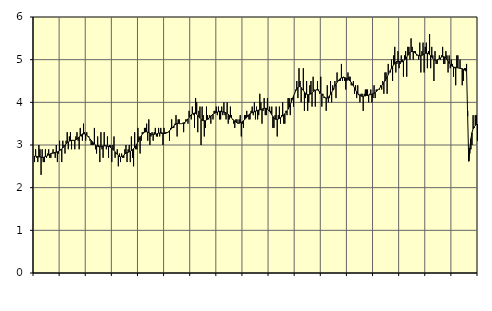
| Category | Hotell och restaurang, SNI 55-56 | Series 1 |
|---|---|---|
| nan | 2.6 | 2.74 |
| 87.0 | 2.9 | 2.74 |
| 87.0 | 2.7 | 2.73 |
| 87.0 | 2.6 | 2.73 |
| 87.0 | 3 | 2.72 |
| 87.0 | 2.9 | 2.72 |
| 87.0 | 2.3 | 2.72 |
| 87.0 | 2.9 | 2.71 |
| 87.0 | 2.6 | 2.71 |
| 87.0 | 2.6 | 2.72 |
| 87.0 | 2.9 | 2.73 |
| 87.0 | 2.7 | 2.74 |
| nan | 2.8 | 2.75 |
| 88.0 | 2.9 | 2.77 |
| 88.0 | 2.7 | 2.78 |
| 88.0 | 2.7 | 2.8 |
| 88.0 | 2.8 | 2.81 |
| 88.0 | 2.9 | 2.81 |
| 88.0 | 2.8 | 2.82 |
| 88.0 | 2.7 | 2.83 |
| 88.0 | 3 | 2.83 |
| 88.0 | 2.6 | 2.84 |
| 88.0 | 2.8 | 2.85 |
| 88.0 | 3.1 | 2.87 |
| nan | 2.9 | 2.88 |
| 89.0 | 2.6 | 2.91 |
| 89.0 | 3.1 | 2.93 |
| 89.0 | 3 | 2.97 |
| 89.0 | 2.8 | 3 |
| 89.0 | 3.1 | 3.03 |
| 89.0 | 3.3 | 3.05 |
| 89.0 | 2.9 | 3.07 |
| 89.0 | 3.2 | 3.09 |
| 89.0 | 3.3 | 3.1 |
| 89.0 | 2.9 | 3.11 |
| 89.0 | 3.1 | 3.11 |
| nan | 3.1 | 3.11 |
| 90.0 | 2.9 | 3.11 |
| 90.0 | 3.2 | 3.12 |
| 90.0 | 3.3 | 3.14 |
| 90.0 | 3.1 | 3.16 |
| 90.0 | 2.9 | 3.19 |
| 90.0 | 3.4 | 3.21 |
| 90.0 | 3.2 | 3.24 |
| 90.0 | 3.1 | 3.26 |
| 90.0 | 3.5 | 3.26 |
| 90.0 | 3.3 | 3.26 |
| 90.0 | 3.1 | 3.25 |
| nan | 3.3 | 3.23 |
| 91.0 | 3.2 | 3.21 |
| 91.0 | 3.2 | 3.18 |
| 91.0 | 3.1 | 3.14 |
| 91.0 | 3 | 3.11 |
| 91.0 | 3 | 3.08 |
| 91.0 | 3 | 3.05 |
| 91.0 | 3.4 | 3.02 |
| 91.0 | 2.9 | 3 |
| 91.0 | 2.8 | 2.98 |
| 91.0 | 3.2 | 2.97 |
| 91.0 | 3 | 2.96 |
| nan | 2.6 | 2.96 |
| 92.0 | 3.3 | 2.97 |
| 92.0 | 2.9 | 2.97 |
| 92.0 | 2.7 | 2.98 |
| 92.0 | 3.3 | 2.98 |
| 92.0 | 3 | 2.98 |
| 92.0 | 2.9 | 2.98 |
| 92.0 | 3.2 | 2.97 |
| 92.0 | 2.7 | 2.97 |
| 92.0 | 3 | 2.96 |
| 92.0 | 3 | 2.94 |
| 92.0 | 2.6 | 2.92 |
| nan | 3 | 2.9 |
| 93.0 | 3.2 | 2.87 |
| 93.0 | 2.7 | 2.84 |
| 93.0 | 2.8 | 2.81 |
| 93.0 | 2.9 | 2.78 |
| 93.0 | 2.5 | 2.75 |
| 93.0 | 2.8 | 2.73 |
| 93.0 | 2.6 | 2.72 |
| 93.0 | 2.8 | 2.73 |
| 93.0 | 2.7 | 2.74 |
| 93.0 | 2.7 | 2.76 |
| 93.0 | 2.9 | 2.79 |
| nan | 3 | 2.81 |
| 94.0 | 2.6 | 2.82 |
| 94.0 | 2.9 | 2.83 |
| 94.0 | 3 | 2.84 |
| 94.0 | 2.6 | 2.85 |
| 94.0 | 3.2 | 2.87 |
| 94.0 | 2.7 | 2.89 |
| 94.0 | 2.5 | 2.91 |
| 94.0 | 3.3 | 2.94 |
| 94.0 | 2.9 | 2.98 |
| 94.0 | 2.9 | 3.02 |
| 94.0 | 3.4 | 3.07 |
| nan | 3.2 | 3.12 |
| 95.0 | 2.8 | 3.17 |
| 95.0 | 3.1 | 3.21 |
| 95.0 | 3.3 | 3.25 |
| 95.0 | 3.3 | 3.28 |
| 95.0 | 3.4 | 3.3 |
| 95.0 | 3.4 | 3.31 |
| 95.0 | 3.5 | 3.31 |
| 95.0 | 3.1 | 3.3 |
| 95.0 | 3.6 | 3.29 |
| 95.0 | 3 | 3.28 |
| 95.0 | 3.2 | 3.26 |
| nan | 3.3 | 3.25 |
| 96.0 | 3.1 | 3.25 |
| 96.0 | 3.3 | 3.25 |
| 96.0 | 3.4 | 3.26 |
| 96.0 | 3.2 | 3.26 |
| 96.0 | 3.2 | 3.27 |
| 96.0 | 3.4 | 3.28 |
| 96.0 | 3.2 | 3.28 |
| 96.0 | 3.4 | 3.28 |
| 96.0 | 3.3 | 3.27 |
| 96.0 | 3 | 3.27 |
| 96.0 | 3.4 | 3.27 |
| nan | 3.3 | 3.27 |
| 97.0 | 3.3 | 3.28 |
| 97.0 | 3.3 | 3.29 |
| 97.0 | 3.3 | 3.31 |
| 97.0 | 3.1 | 3.33 |
| 97.0 | 3.4 | 3.36 |
| 97.0 | 3.6 | 3.39 |
| 97.0 | 3.4 | 3.42 |
| 97.0 | 3.4 | 3.45 |
| 97.0 | 3.5 | 3.47 |
| 97.0 | 3.7 | 3.49 |
| 97.0 | 3.2 | 3.5 |
| nan | 3.6 | 3.51 |
| 98.0 | 3.6 | 3.5 |
| 98.0 | 3.5 | 3.5 |
| 98.0 | 3.5 | 3.5 |
| 98.0 | 3.5 | 3.51 |
| 98.0 | 3.3 | 3.52 |
| 98.0 | 3.5 | 3.53 |
| 98.0 | 3.6 | 3.55 |
| 98.0 | 3.6 | 3.58 |
| 98.0 | 3.5 | 3.61 |
| 98.0 | 3.8 | 3.65 |
| 98.0 | 3.7 | 3.68 |
| nan | 3.6 | 3.71 |
| 99.0 | 3.9 | 3.73 |
| 99.0 | 3.7 | 3.74 |
| 99.0 | 3.4 | 3.75 |
| 99.0 | 4.1 | 3.74 |
| 99.0 | 4 | 3.72 |
| 99.0 | 3.3 | 3.69 |
| 99.0 | 3.8 | 3.66 |
| 99.0 | 3.9 | 3.63 |
| 99.0 | 3 | 3.6 |
| 99.0 | 3.9 | 3.58 |
| 99.0 | 3.7 | 3.57 |
| nan | 3.2 | 3.57 |
| 0.0 | 3.4 | 3.57 |
| 0.0 | 3.9 | 3.59 |
| 0.0 | 3.7 | 3.6 |
| 0.0 | 3.6 | 3.63 |
| 0.0 | 3.7 | 3.65 |
| 0.0 | 3.5 | 3.68 |
| 0.0 | 3.7 | 3.7 |
| 0.0 | 3.6 | 3.72 |
| 0.0 | 3.8 | 3.74 |
| 0.0 | 3.8 | 3.75 |
| 0.0 | 3.9 | 3.76 |
| nan | 3.7 | 3.77 |
| 1.0 | 3.9 | 3.78 |
| 1.0 | 3.6 | 3.79 |
| 1.0 | 3.6 | 3.79 |
| 1.0 | 3.9 | 3.78 |
| 1.0 | 3.7 | 3.78 |
| 1.0 | 4 | 3.77 |
| 1.0 | 3.7 | 3.77 |
| 1.0 | 3.6 | 3.75 |
| 1.0 | 4 | 3.74 |
| 1.0 | 3.5 | 3.72 |
| 1.0 | 3.6 | 3.69 |
| nan | 3.9 | 3.66 |
| 2.0 | 3.7 | 3.63 |
| 2.0 | 3.6 | 3.61 |
| 2.0 | 3.5 | 3.58 |
| 2.0 | 3.4 | 3.56 |
| 2.0 | 3.6 | 3.54 |
| 2.0 | 3.6 | 3.52 |
| 2.0 | 3.5 | 3.51 |
| 2.0 | 3.6 | 3.51 |
| 2.0 | 3.7 | 3.52 |
| 2.0 | 3.2 | 3.53 |
| 2.0 | 3.5 | 3.55 |
| nan | 3.4 | 3.57 |
| 3.0 | 3.7 | 3.59 |
| 3.0 | 3.7 | 3.62 |
| 3.0 | 3.8 | 3.65 |
| 3.0 | 3.7 | 3.68 |
| 3.0 | 3.6 | 3.71 |
| 3.0 | 3.6 | 3.73 |
| 3.0 | 3.8 | 3.75 |
| 3.0 | 3.9 | 3.76 |
| 3.0 | 3.7 | 3.77 |
| 3.0 | 4 | 3.78 |
| 3.0 | 3.6 | 3.79 |
| nan | 3.9 | 3.8 |
| 4.0 | 3.6 | 3.81 |
| 4.0 | 3.7 | 3.82 |
| 4.0 | 4.2 | 3.82 |
| 4.0 | 4 | 3.83 |
| 4.0 | 3.5 | 3.84 |
| 4.0 | 3.8 | 3.85 |
| 4.0 | 4.1 | 3.86 |
| 4.0 | 3.7 | 3.86 |
| 4.0 | 3.7 | 3.86 |
| 4.0 | 4.1 | 3.84 |
| 4.0 | 3.8 | 3.82 |
| nan | 3.9 | 3.79 |
| 5.0 | 3.8 | 3.75 |
| 5.0 | 3.9 | 3.71 |
| 5.0 | 3.4 | 3.67 |
| 5.0 | 3.4 | 3.63 |
| 5.0 | 3.7 | 3.61 |
| 5.0 | 3.9 | 3.6 |
| 5.0 | 3.2 | 3.6 |
| 5.0 | 3.7 | 3.61 |
| 5.0 | 3.9 | 3.62 |
| 5.0 | 3.5 | 3.64 |
| 5.0 | 3.7 | 3.66 |
| nan | 4 | 3.68 |
| 6.0 | 3.5 | 3.71 |
| 6.0 | 3.5 | 3.73 |
| 6.0 | 3.8 | 3.76 |
| 6.0 | 3.7 | 3.8 |
| 6.0 | 4.1 | 3.84 |
| 6.0 | 4.1 | 3.89 |
| 6.0 | 3.7 | 3.95 |
| 6.0 | 4.1 | 4.01 |
| 6.0 | 4.1 | 4.08 |
| 6.0 | 3.9 | 4.15 |
| 6.0 | 4.2 | 4.21 |
| nan | 4.3 | 4.27 |
| 7.0 | 4.5 | 4.31 |
| 7.0 | 4.1 | 4.35 |
| 7.0 | 4.8 | 4.37 |
| 7.0 | 4.5 | 4.37 |
| 7.0 | 4 | 4.35 |
| 7.0 | 4.3 | 4.31 |
| 7.0 | 4.8 | 4.28 |
| 7.0 | 3.8 | 4.24 |
| 7.0 | 4.1 | 4.21 |
| 7.0 | 4.5 | 4.19 |
| 7.0 | 3.8 | 4.18 |
| nan | 4 | 4.18 |
| 8.0 | 4.4 | 4.19 |
| 8.0 | 4.5 | 4.2 |
| 8.0 | 3.9 | 4.22 |
| 8.0 | 4.6 | 4.25 |
| 8.0 | 4.3 | 4.27 |
| 8.0 | 3.9 | 4.28 |
| 8.0 | 4.3 | 4.29 |
| 8.0 | 4.5 | 4.29 |
| 8.0 | 4.3 | 4.27 |
| 8.0 | 4.2 | 4.25 |
| 8.0 | 4.6 | 4.22 |
| nan | 3.9 | 4.19 |
| 9.0 | 4.2 | 4.16 |
| 9.0 | 4.1 | 4.13 |
| 9.0 | 4.1 | 4.11 |
| 9.0 | 3.8 | 4.1 |
| 9.0 | 4.4 | 4.1 |
| 9.0 | 4 | 4.12 |
| 9.0 | 4.1 | 4.15 |
| 9.0 | 4.5 | 4.19 |
| 9.0 | 4 | 4.23 |
| 9.0 | 4.4 | 4.28 |
| 9.0 | 4.3 | 4.33 |
| nan | 4.5 | 4.38 |
| 10.0 | 4.1 | 4.42 |
| 10.0 | 4.7 | 4.47 |
| 10.0 | 4.5 | 4.5 |
| 10.0 | 4.5 | 4.53 |
| 10.0 | 4.5 | 4.56 |
| 10.0 | 4.9 | 4.57 |
| 10.0 | 4.5 | 4.58 |
| 10.0 | 4.6 | 4.58 |
| 10.0 | 4.5 | 4.58 |
| 10.0 | 4.3 | 4.57 |
| 10.0 | 4.5 | 4.56 |
| nan | 4.7 | 4.54 |
| 11.0 | 4.6 | 4.52 |
| 11.0 | 4.6 | 4.5 |
| 11.0 | 4.4 | 4.47 |
| 11.0 | 4.4 | 4.43 |
| 11.0 | 4.5 | 4.39 |
| 11.0 | 4.2 | 4.34 |
| 11.0 | 4.4 | 4.29 |
| 11.0 | 4.1 | 4.24 |
| 11.0 | 4.4 | 4.2 |
| 11.0 | 4.2 | 4.17 |
| 11.0 | 4 | 4.16 |
| nan | 4.2 | 4.15 |
| 12.0 | 4.2 | 4.14 |
| 12.0 | 3.8 | 4.14 |
| 12.0 | 4.2 | 4.15 |
| 12.0 | 4.3 | 4.15 |
| 12.0 | 4.3 | 4.16 |
| 12.0 | 4.3 | 4.16 |
| 12.0 | 4 | 4.17 |
| 12.0 | 4.2 | 4.18 |
| 12.0 | 4.3 | 4.18 |
| 12.0 | 4 | 4.19 |
| 12.0 | 4.1 | 4.2 |
| nan | 4.4 | 4.21 |
| 13.0 | 4.1 | 4.23 |
| 13.0 | 4.3 | 4.25 |
| 13.0 | 4.3 | 4.28 |
| 13.0 | 4.3 | 4.3 |
| 13.0 | 4.3 | 4.33 |
| 13.0 | 4.4 | 4.36 |
| 13.0 | 4.3 | 4.39 |
| 13.0 | 4.5 | 4.43 |
| 13.0 | 4.2 | 4.46 |
| 13.0 | 4.7 | 4.5 |
| 13.0 | 4.7 | 4.55 |
| nan | 4.2 | 4.59 |
| 14.0 | 4.9 | 4.65 |
| 14.0 | 4.7 | 4.7 |
| 14.0 | 4.7 | 4.75 |
| 14.0 | 5 | 4.8 |
| 14.0 | 4.5 | 4.84 |
| 14.0 | 5.1 | 4.88 |
| 14.0 | 5.3 | 4.92 |
| 14.0 | 4.7 | 4.94 |
| 14.0 | 4.9 | 4.96 |
| 14.0 | 5.2 | 4.96 |
| 14.0 | 4.8 | 4.96 |
| nan | 4.9 | 4.95 |
| 15.0 | 5.1 | 4.95 |
| 15.0 | 5 | 4.95 |
| 15.0 | 4.6 | 4.97 |
| 15.0 | 5.1 | 4.99 |
| 15.0 | 5.2 | 5.02 |
| 15.0 | 4.6 | 5.06 |
| 15.0 | 5.3 | 5.1 |
| 15.0 | 5.3 | 5.14 |
| 15.0 | 5 | 5.17 |
| 15.0 | 5.5 | 5.19 |
| 15.0 | 5.3 | 5.19 |
| nan | 5 | 5.19 |
| 16.0 | 5.2 | 5.17 |
| 16.0 | 5.2 | 5.15 |
| 16.0 | 5.1 | 5.13 |
| 16.0 | 5.1 | 5.11 |
| 16.0 | 5 | 5.1 |
| 16.0 | 5.4 | 5.09 |
| 16.0 | 4.7 | 5.09 |
| 16.0 | 5.2 | 5.1 |
| 16.0 | 5.4 | 5.12 |
| 16.0 | 4.7 | 5.13 |
| 16.0 | 5.3 | 5.15 |
| nan | 5.4 | 5.15 |
| 17.0 | 4.8 | 5.15 |
| 17.0 | 5.2 | 5.14 |
| 17.0 | 5.6 | 5.12 |
| 17.0 | 4.8 | 5.09 |
| 17.0 | 5.3 | 5.06 |
| 17.0 | 5.1 | 5.03 |
| 17.0 | 4.5 | 5 |
| 17.0 | 5.2 | 4.99 |
| 17.0 | 4.9 | 4.98 |
| 17.0 | 4.9 | 4.99 |
| 17.0 | 5 | 5.01 |
| nan | 5.1 | 5.02 |
| 18.0 | 5 | 5.04 |
| 18.0 | 5.1 | 5.06 |
| 18.0 | 5.3 | 5.07 |
| 18.0 | 4.9 | 5.07 |
| 18.0 | 4.9 | 5.06 |
| 18.0 | 5.2 | 5.04 |
| 18.0 | 5.1 | 5 |
| 18.0 | 4.7 | 4.96 |
| 18.0 | 5.1 | 4.92 |
| 18.0 | 4.8 | 4.88 |
| 18.0 | 5 | 4.86 |
| nan | 4.9 | 4.84 |
| 19.0 | 4.6 | 4.83 |
| 19.0 | 4.8 | 4.82 |
| 19.0 | 4.4 | 4.82 |
| 19.0 | 5.1 | 4.81 |
| 19.0 | 5.1 | 4.81 |
| 19.0 | 4.8 | 4.8 |
| 19.0 | 5 | 4.8 |
| 19.0 | 4.8 | 4.79 |
| 19.0 | 4.4 | 4.79 |
| 19.0 | 4.5 | 4.77 |
| 19.0 | 4.8 | 4.76 |
| nan | 4.8 | 4.74 |
| 20.0 | 4.9 | 4.73 |
| 20.0 | 3.8 | 3.67 |
| 20.0 | 2.8 | 2.62 |
| 20.0 | 2.8 | 2.93 |
| 20.0 | 2.9 | 3.15 |
| 20.0 | 3 | 3.29 |
| 20.0 | 3.7 | 3.38 |
| 20.0 | 3.4 | 3.43 |
| 20.0 | 3.7 | 3.46 |
| 20.0 | 3.7 | 3.48 |
| 20.0 | 3.1 | 3.49 |